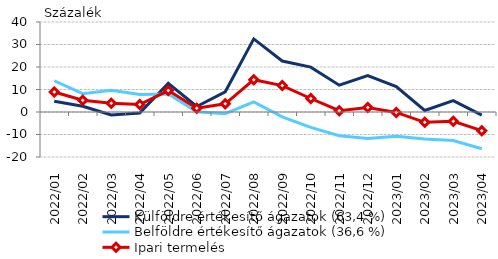
| Category | Külföldre értékesítő ágazatok (63,4 %) | Belföldre értékesítő ágazatok (36,6 %) | Ipari termelés |
|---|---|---|---|
| 2022-01-01 | 4.82 | 13.888 | 8.861 |
| 2022-02-01 | 2.553 | 8.134 | 5.265 |
| 2022-03-01 | -1.303 | 9.64 | 3.868 |
| 2022-04-01 | -0.497 | 7.786 | 3.3 |
| 2022-05-01 | 12.788 | 7.977 | 9.53 |
| 2022-06-01 | 2.438 | 0.109 | 1.657 |
| 2022-07-01 | 8.978 | -0.739 | 3.622 |
| 2022-08-01 | 32.488 | 4.51 | 14.375 |
| 2022-09-01 | 22.671 | -2.172 | 11.746 |
| 2022-10-01 | 19.944 | -6.823 | 5.999 |
| 2022-11-01 | 11.916 | -10.58 | 0.564 |
| 2022-12-01 | 16.215 | -11.732 | 2.027 |
| 2023-01-01 | 11.326 | -10.817 | -0.198 |
| 2023-02-01 | 0.68 | -11.987 | -4.598 |
| 2023-03-01 | 5.023 | -12.667 | -4.1 |
| 2023-04-01 | -1.374 | -16.33 | -8.3 |